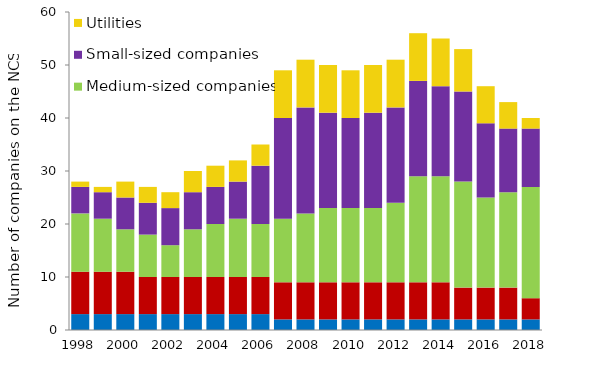
| Category | Large Norwegian companies | Majors | Medium-sized companies | Small-sized companies | Utilities |
|---|---|---|---|---|---|
| 1998.0 | 3 | 8 | 11 | 5 | 1 |
| 1999.0 | 3 | 8 | 10 | 5 | 1 |
| 2000.0 | 3 | 8 | 8 | 6 | 3 |
| 2001.0 | 3 | 7 | 8 | 6 | 3 |
| 2002.0 | 3 | 7 | 6 | 7 | 3 |
| 2003.0 | 3 | 7 | 9 | 7 | 4 |
| 2004.0 | 3 | 7 | 10 | 7 | 4 |
| 2005.0 | 3 | 7 | 11 | 7 | 4 |
| 2006.0 | 3 | 7 | 10 | 11 | 4 |
| 2007.0 | 2 | 7 | 12 | 19 | 9 |
| 2008.0 | 2 | 7 | 13 | 20 | 9 |
| 2009.0 | 2 | 7 | 14 | 18 | 9 |
| 2010.0 | 2 | 7 | 14 | 17 | 9 |
| 2011.0 | 2 | 7 | 14 | 18 | 9 |
| 2012.0 | 2 | 7 | 15 | 18 | 9 |
| 2013.0 | 2 | 7 | 20 | 18 | 9 |
| 2014.0 | 2 | 7 | 20 | 17 | 9 |
| 2015.0 | 2 | 6 | 20 | 17 | 8 |
| 2016.0 | 2 | 6 | 17 | 14 | 7 |
| 2017.0 | 2 | 6 | 18 | 12 | 5 |
| 2018.0 | 2 | 4 | 21 | 11 | 2 |